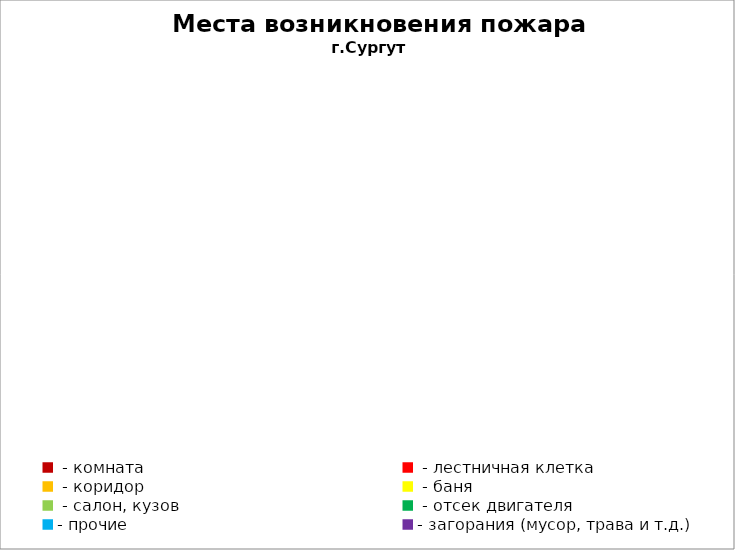
| Category | Места возникновения пожара |
|---|---|
|  - комната | 56 |
|  - лестничная клетка | 27 |
|  - коридор | 10 |
|  - баня | 28 |
|  - салон, кузов | 11 |
|  - отсек двигателя | 38 |
| - прочие | 151 |
| - загорания (мусор, трава и т.д.)  | 172 |